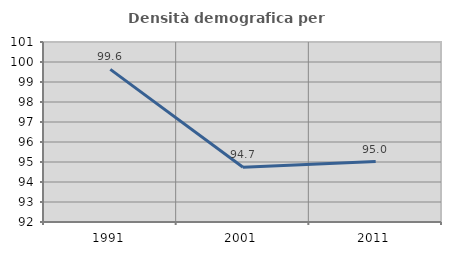
| Category | Densità demografica |
|---|---|
| 1991.0 | 99.63 |
| 2001.0 | 94.738 |
| 2011.0 | 95.024 |